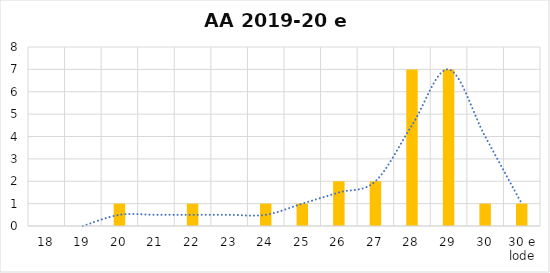
| Category | Series 0 |
|---|---|
| 18 | 0 |
| 19 | 0 |
| 20 | 1 |
| 21 | 0 |
| 22 | 1 |
| 23 | 0 |
| 24 | 1 |
| 25 | 1 |
| 26 | 2 |
| 27 | 2 |
| 28 | 7 |
| 29 | 7 |
| 30 | 1 |
| 30 e lode | 1 |